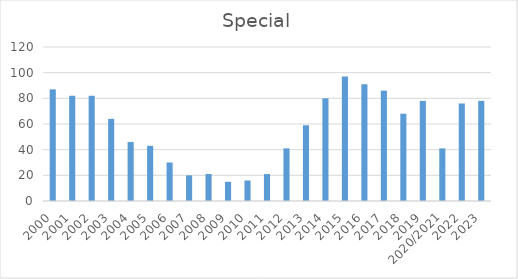
| Category | Special |
|---|---|
| 2000 | 87 |
| 2001 | 82 |
| 2002 | 82 |
| 2003 | 64 |
| 2004 | 46 |
| 2005 | 43 |
| 2006 | 30 |
| 2007 | 20 |
| 2008 | 21 |
| 2009 | 15 |
| 2010 | 16 |
| 2011 | 21 |
| 2012 | 41 |
| 2013 | 59 |
| 2014 | 80 |
| 2015 | 97 |
| 2016 | 91 |
| 2017 | 86 |
| 2018 | 68 |
| 2019 | 78 |
| 2020/2021 | 41 |
| 2022 | 76 |
| 2023 | 78 |